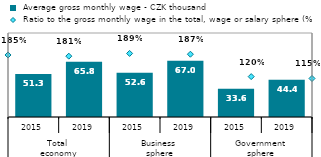
| Category |  Average gross monthly wage - CZK thousand |
|---|---|
| 0 | 51.319 |
| 1 | 65.787 |
| 2 | 52.643 |
| 3 | 66.964 |
| 4 | 33.607 |
| 5 | 44.351 |